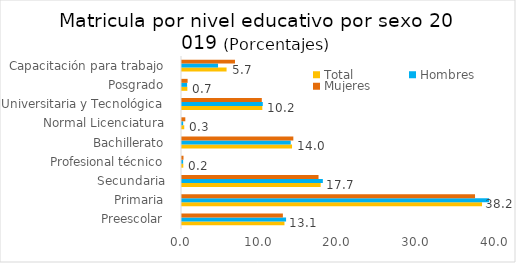
| Category | Total  | Hombres | Mujeres |
|---|---|---|---|
| Preescolar  | 13.054 | 13.258 | 12.852 |
| Primaria  | 38.22 | 39.122 | 37.33 |
| Secundaria  | 17.665 | 17.942 | 17.392 |
| Profesional técnico  | 0.167 | 0.144 | 0.19 |
| Bachillerato  | 14.018 | 13.85 | 14.183 |
| Normal Licenciatura  | 0.286 | 0.148 | 0.422 |
| Universitaria y Tecnológica  | 10.229 | 10.292 | 10.166 |
| Posgrado  | 0.684 | 0.652 | 0.715 |
| Capacitación para trabajo  | 5.677 | 4.591 | 6.75 |